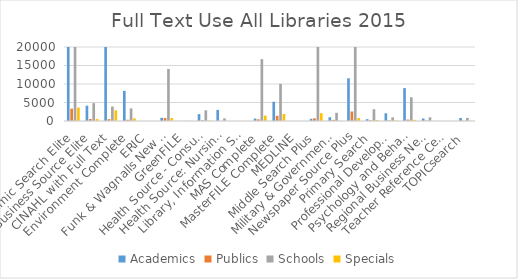
| Category | Academics | Publics | Schools | Specials |
|---|---|---|---|---|
| Academic Search Elite | 36688 | 3338 | 31445 | 3644 |
| Business Source Elite | 4142 | 548 | 4828 | 526 |
| CINAHL with Full Text | 42643 | 503 | 3913 | 2891 |
| Environment Complete | 8146 | 340 | 3414 | 705 |
| ERIC | 0 | 0 | 0 | 0 |
| Funk & Wagnalls New World Encyclopedia | 848 | 809 | 14056 | 797 |
| GreenFILE | 31 | 10 | 58 | 0 |
| Health Source - Consumer Edition | 1859 | 186 | 2898 | 103 |
| Health Source: Nursing/Academic Edition | 2998 | 31 | 703 | 40 |
| Library, Information Science & Technology Abstracts | 0 | 0 | 0 | 0 |
| MAS Complete | 661 | 449 | 16717 | 1455 |
| MasterFILE Complete | 5204 | 1420 | 10035 | 1896 |
| MEDLINE | 0 | 0 | 0 | 0 |
| Middle Search Plus | 592 | 733 | 21399 | 2122 |
| Military & Government Collection | 1024 | 309 | 2203 | 96 |
| Newspaper Source Plus | 11548 | 2570 | 20886 | 790 |
| Primary Search | 485 | 179 | 3173 | 288 |
| Professional Development Collection | 2092 | 161 | 979 | 148 |
| Psychology and Behavioral Sciences Collection | 8897 | 384 | 6407 | 313 |
| Regional Business News | 680 | 116 | 1003 | 43 |
| Teacher Reference Center | 0 | 0 | 0 | 0 |
| TOPICsearch | 806 | 81 | 833 | 67 |